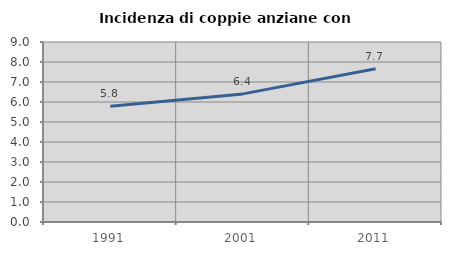
| Category | Incidenza di coppie anziane con figli |
|---|---|
| 1991.0 | 5.79 |
| 2001.0 | 6.406 |
| 2011.0 | 7.663 |